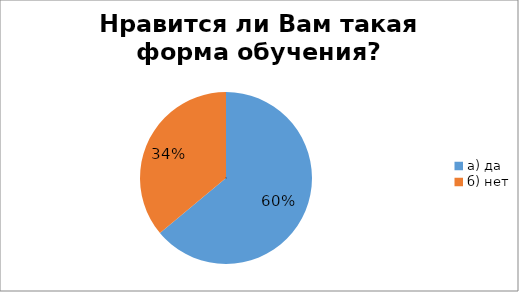
| Category | Series 0 |
|---|---|
| а) да | 60.309 |
| б) нет | 34.021 |